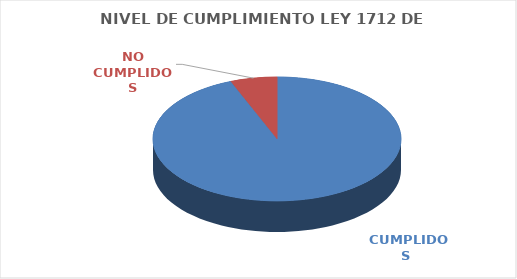
| Category | Series 0 |
|---|---|
|  CUMPLIDOS | 108 |
| NO CUMPLIDOS | 7 |